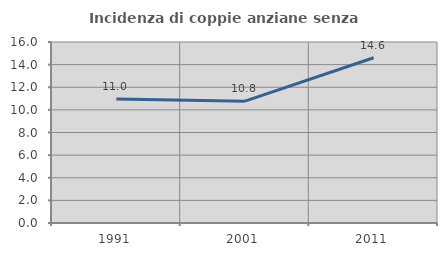
| Category | Incidenza di coppie anziane senza figli  |
|---|---|
| 1991.0 | 10.952 |
| 2001.0 | 10.772 |
| 2011.0 | 14.611 |